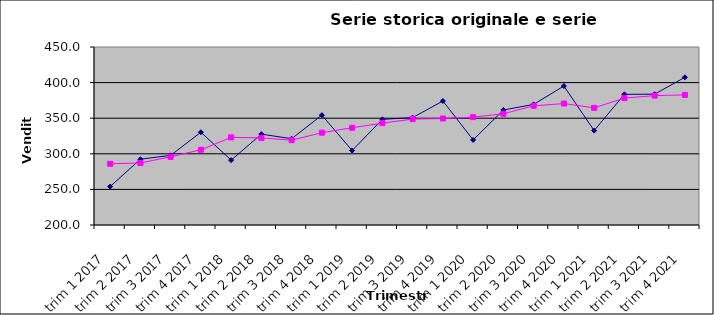
| Category | y | Series 1 |
|---|---|---|
| trim 1 2017 | 254 | 285.961 |
| trim 2 2017 | 292.4 | 287.147 |
| trim 3 2017 | 297.8 | 295.733 |
| trim 4 2017 | 330.3 | 305.659 |
| trim 1 2018 | 291.1 | 323.061 |
| trim 2 2018 | 327.6 | 322.347 |
| trim 3 2018 | 321.2 | 319.133 |
| trim 4 2018 | 354.3 | 329.659 |
| trim 1 2019 | 304.6 | 336.561 |
| trim 2 2019 | 348.4 | 343.147 |
| trim 3 2019 | 350.8 | 348.733 |
| trim 4 2019 | 374.2 | 349.559 |
| trim 1 2020 | 319.5 | 351.461 |
| trim 2 2020 | 361.5 | 356.247 |
| trim 3 2020 | 369.4 | 367.333 |
| trim 4 2020 | 395.2 | 370.559 |
| trim 1 2021 | 332.6 | 364.561 |
| trim 2 2021 | 383.5 | 378.247 |
| trim 3 2021 | 383.8 | 381.733 |
| trim 4 2021 | 407.4 | 382.759 |